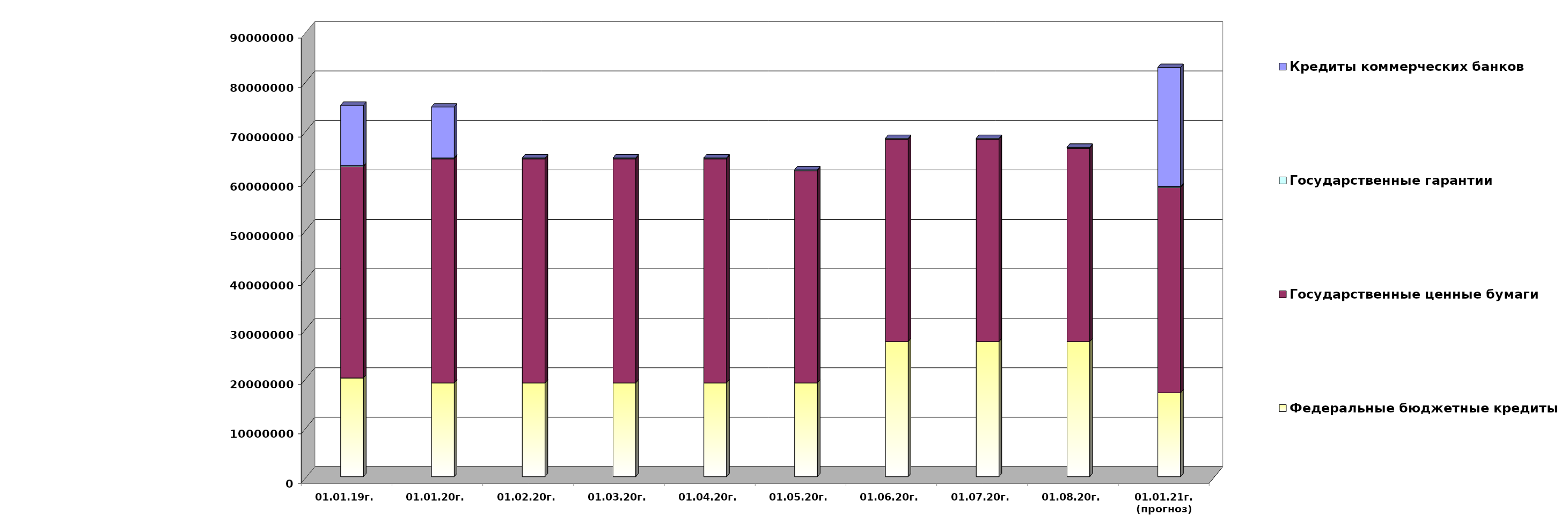
| Category | Федеральные бюджетные кредиты | Государственные ценные бумаги  | Государственные гарантии | Кредиты коммерческих банков |
|---|---|---|---|---|
| 01.01.19г. | 19957026.213 | 42700000 | 209872.86 | 12219963.75 |
| 01.01.20г. | 18954967.463 | 45300000 | 186330.02 | 10291177 |
| 01.02.20г. | 18954967.463 | 45300000 | 184738.25 | 0 |
| 01.03.20г. | 18954967.463 | 45300000 | 184738.25 | 0 |
| 01.04.20г. | 18954967.463 | 45300000 | 184738.25 | 0 |
| 01.05.20г. | 18954967.463 | 42900000 | 184738.25 | 0 |
| 01.06.20г. | 27303300.463 | 40900000 | 184738.25 | 0 |
| 01.07.20г. | 27303300.463 | 40900000 | 184738.25 | 0 |
| 01.08.20г. | 27303300.463 | 39100000 | 184738.25 | 0 |
| 01.01.21г.
(прогноз) | 16950850 | 41500000 | 184738.2 | 24104738.7 |